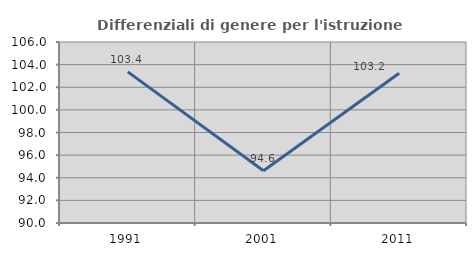
| Category | Differenziali di genere per l'istruzione superiore |
|---|---|
| 1991.0 | 103.358 |
| 2001.0 | 94.622 |
| 2011.0 | 103.243 |